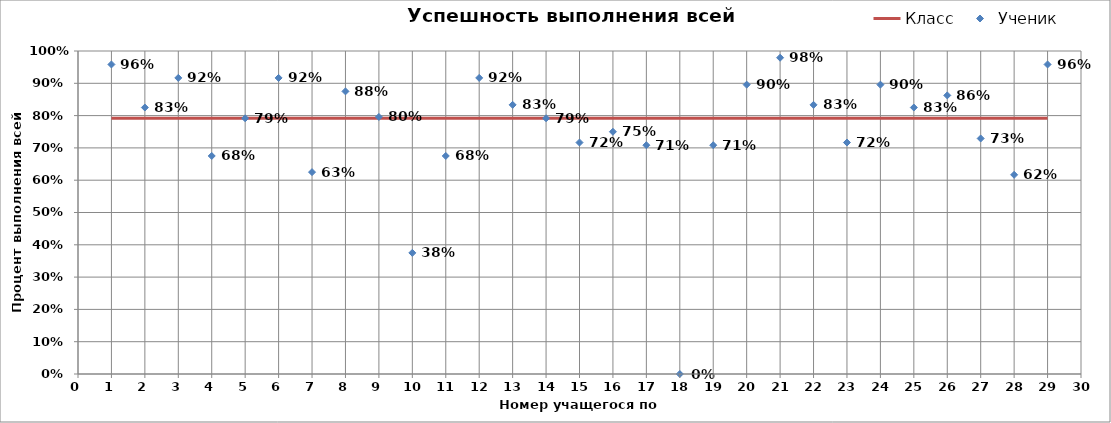
| Category | Класс |
|---|---|
| 0 | 0.792 |
| 1 | 0.792 |
| 2 | 0.792 |
| 3 | 0.792 |
| 4 | 0.792 |
| 5 | 0.792 |
| 6 | 0.792 |
| 7 | 0.792 |
| 8 | 0.792 |
| 9 | 0.792 |
| 10 | 0.792 |
| 11 | 0.792 |
| 12 | 0.792 |
| 13 | 0.792 |
| 14 | 0.792 |
| 15 | 0.792 |
| 16 | 0.792 |
| 17 | 0.792 |
| 18 | 0.792 |
| 19 | 0.792 |
| 20 | 0.792 |
| 21 | 0.792 |
| 22 | 0.792 |
| 23 | 0.792 |
| 24 | 0.792 |
| 25 | 0.792 |
| 26 | 0.792 |
| 27 | 0.792 |
| 28 | 0.792 |
| 29 | 0.792 |
| 30 | 0.792 |
| 31 | 0.792 |
| 32 | 0.792 |
| 33 | 0.792 |
| 34 | 0.792 |
| 35 | 0.792 |
| 36 | 0.792 |
| 37 | 0.792 |
| 38 | 0.792 |
| 39 | 0.792 |